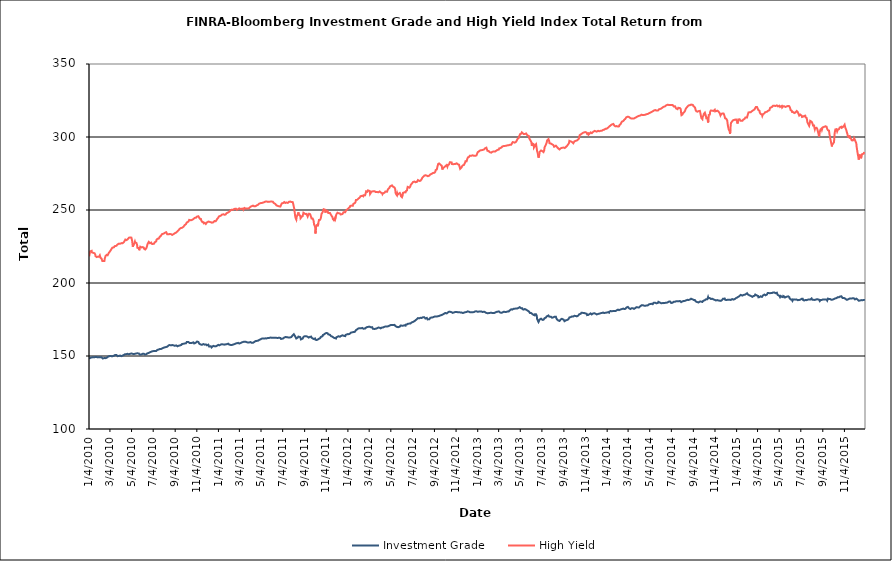
| Category | Investment Grade | High Yield |
|---|---|---|
| 1/4/10 | 148.138 | 218.276 |
| 1/5/10 | 148.728 | 219.533 |
| 1/6/10 | 148.687 | 220.973 |
| 1/7/10 | 148.791 | 221.667 |
| 1/8/10 | 148.871 | 221.768 |
| 1/11/10 | 148.965 | 222.058 |
| 1/12/10 | 149.302 | 220.936 |
| 1/13/10 | 149.169 | 221.002 |
| 1/14/10 | 149.16 | 220.851 |
| 1/15/10 | 149.443 | 220.69 |
| 1/19/10 | 149.142 | 220.408 |
| 1/20/10 | 149.341 | 220.144 |
| 1/21/10 | 149.537 | 219.594 |
| 1/22/10 | 149.358 | 218.364 |
| 1/25/10 | 149.258 | 217.768 |
| 1/26/10 | 149.302 | 217.635 |
| 1/27/10 | 149.185 | 218.028 |
| 1/28/10 | 149.057 | 217.984 |
| 1/29/10 | 149.097 | 217.958 |
| 2/1/10 | 149.11 | 218.038 |
| 2/2/10 | 149.242 | 218.46 |
| 2/3/10 | 149.11 | 218.924 |
| 2/4/10 | 149.181 | 218.611 |
| 2/5/10 | 149.188 | 217.3 |
| 2/8/10 | 149.118 | 216.652 |
| 2/9/10 | 148.96 | 216.199 |
| 2/10/10 | 148.733 | 215.145 |
| 2/11/10 | 148.306 | 214.966 |
| 2/12/10 | 148.631 | 215.187 |
| 2/16/10 | 148.612 | 215.148 |
| 2/17/10 | 148.607 | 216.754 |
| 2/18/10 | 148.543 | 217.542 |
| 2/19/10 | 148.518 | 218.407 |
| 2/22/10 | 148.735 | 219.255 |
| 2/23/10 | 149.048 | 218.904 |
| 2/24/10 | 149.199 | 219.077 |
| 2/25/10 | 149.317 | 219.009 |
| 2/26/10 | 149.72 | 219.579 |
| 3/1/10 | 149.806 | 220.874 |
| 3/2/10 | 149.879 | 221.253 |
| 3/3/10 | 149.999 | 221.505 |
| 3/4/10 | 150.058 | 221.754 |
| 3/5/10 | 149.837 | 222.349 |
| 3/8/10 | 149.871 | 223.336 |
| 3/9/10 | 149.986 | 223.623 |
| 3/10/10 | 149.839 | 224.107 |
| 3/11/10 | 149.843 | 224.21 |
| 3/12/10 | 150.118 | 224.465 |
| 3/15/10 | 150.237 | 224.508 |
| 3/16/10 | 150.455 | 224.314 |
| 3/17/10 | 150.685 | 225.249 |
| 3/18/10 | 150.697 | 225.602 |
| 3/19/10 | 150.695 | 225.533 |
| 3/22/10 | 150.701 | 225.49 |
| 3/23/10 | 150.774 | 225.713 |
| 3/24/10 | 150.157 | 226.224 |
| 3/25/10 | 149.904 | 226.327 |
| 3/26/10 | 149.978 | 226.844 |
| 3/29/10 | 150.108 | 226.98 |
| 3/30/10 | 150.193 | 227.317 |
| 3/31/10 | 150.422 | 227.06 |
| 4/1/10 | 150.302 | 226.854 |
| 4/5/10 | 149.89 | 227.336 |
| 4/6/10 | 149.886 | 227.114 |
| 4/7/10 | 150.166 | 227.482 |
| 4/8/10 | 150.222 | 227.201 |
| 4/9/10 | 150.367 | 227.559 |
| 4/12/10 | 150.743 | 228.013 |
| 4/13/10 | 150.977 | 228.362 |
| 4/14/10 | 151.082 | 228.862 |
| 4/15/10 | 151.197 | 229.417 |
| 4/16/10 | 151.43 | 229.746 |
| 4/19/10 | 151.29 | 229.378 |
| 4/20/10 | 151.303 | 229.613 |
| 4/21/10 | 151.516 | 229.922 |
| 4/22/10 | 151.505 | 229.786 |
| 4/23/10 | 151.187 | 230.343 |
| 4/26/10 | 151.183 | 231.026 |
| 4/27/10 | 151.518 | 230.985 |
| 4/28/10 | 151.375 | 230.656 |
| 4/29/10 | 151.484 | 231.163 |
| 4/30/10 | 151.823 | 231.044 |
| 5/3/10 | 151.714 | 231.082 |
| 5/4/10 | 151.911 | 230.704 |
| 5/5/10 | 151.871 | 229.082 |
| 5/6/10 | 151.518 | 226.956 |
| 5/7/10 | 150.982 | 224.839 |
| 5/10/10 | 151.305 | 226.831 |
| 5/11/10 | 151.261 | 226.496 |
| 5/12/10 | 151.206 | 227.638 |
| 5/13/10 | 151.488 | 228.391 |
| 5/14/10 | 151.808 | 227.589 |
| 5/17/10 | 151.785 | 227.491 |
| 5/18/10 | 151.962 | 227.398 |
| 5/19/10 | 151.883 | 226.231 |
| 5/20/10 | 151.828 | 224.056 |
| 5/21/10 | 151.576 | 223.475 |
| 5/24/10 | 151.744 | 224.018 |
| 5/25/10 | 151.254 | 222.441 |
| 5/26/10 | 151.228 | 223.388 |
| 5/27/10 | 150.909 | 224.158 |
| 5/28/10 | 151.267 | 224.872 |
| 6/1/10 | 151.166 | 224.359 |
| 6/2/10 | 151.005 | 224.369 |
| 6/3/10 | 151.087 | 224.964 |
| 6/4/10 | 151.536 | 224.598 |
| 6/7/10 | 151.568 | 224.254 |
| 6/8/10 | 151.449 | 223.379 |
| 6/9/10 | 151.431 | 223.411 |
| 6/10/10 | 151.033 | 223.391 |
| 6/11/10 | 151.068 | 222.938 |
| 6/14/10 | 151.168 | 223.8 |
| 6/15/10 | 151.237 | 224.435 |
| 6/16/10 | 151.35 | 225.145 |
| 6/17/10 | 151.85 | 226.255 |
| 6/18/10 | 151.95 | 226.827 |
| 6/21/10 | 152.099 | 228.18 |
| 6/22/10 | 152.336 | 227.899 |
| 6/23/10 | 152.544 | 227.893 |
| 6/24/10 | 152.505 | 227.317 |
| 6/25/10 | 152.512 | 227.529 |
| 6/28/10 | 152.919 | 227.662 |
| 6/29/10 | 153.088 | 226.881 |
| 6/30/10 | 153.256 | 227.281 |
| 7/1/10 | 153.26 | 226.657 |
| 7/2/10 | 153.296 | 226.726 |
| 7/6/10 | 153.401 | 226.935 |
| 7/7/10 | 153.275 | 227.239 |
| 7/8/10 | 153.332 | 227.914 |
| 7/9/10 | 153.346 | 228.3 |
| 7/12/10 | 153.406 | 228.5 |
| 7/13/10 | 153.508 | 229.676 |
| 7/14/10 | 153.54 | 229.747 |
| 7/15/10 | 154.186 | 230.02 |
| 7/16/10 | 154.45 | 230.311 |
| 7/19/10 | 154.421 | 230.396 |
| 7/20/10 | 154.571 | 230.597 |
| 7/21/10 | 154.713 | 230.948 |
| 7/22/10 | 154.81 | 231.615 |
| 7/23/10 | 154.787 | 232.159 |
| 7/26/10 | 154.819 | 232.551 |
| 7/27/10 | 154.919 | 233.167 |
| 7/28/10 | 154.953 | 233.424 |
| 7/29/10 | 155.219 | 233.158 |
| 7/30/10 | 155.681 | 233.528 |
| 8/2/10 | 155.664 | 233.845 |
| 8/3/10 | 155.934 | 234.218 |
| 8/4/10 | 155.819 | 234.224 |
| 8/5/10 | 155.907 | 234.331 |
| 8/6/10 | 156.202 | 234.611 |
| 8/9/10 | 156.185 | 234.826 |
| 8/10/10 | 156.305 | 234.462 |
| 8/11/10 | 156.415 | 234.013 |
| 8/12/10 | 156.375 | 233.324 |
| 8/13/10 | 156.5 | 233.036 |
| 8/16/10 | 157.283 | 233.307 |
| 8/17/10 | 157.199 | 233.51 |
| 8/18/10 | 157.299 | 233.735 |
| 8/19/10 | 157.491 | 233.606 |
| 8/20/10 | 157.371 | 233.25 |
| 8/23/10 | 157.306 | 233.433 |
| 8/24/10 | 157.642 | 233.185 |
| 8/25/10 | 157.604 | 233.111 |
| 8/26/10 | 157.53 | 232.964 |
| 8/27/10 | 157.001 | 233.13 |
| 8/30/10 | 157.269 | 233.482 |
| 8/31/10 | 157.502 | 233.106 |
| 9/1/10 | 157.137 | 233.487 |
| 9/2/10 | 156.997 | 233.998 |
| 9/3/10 | 156.836 | 234.431 |
| 9/7/10 | 157.25 | 234.672 |
| 9/8/10 | 157.273 | 234.77 |
| 9/9/10 | 156.872 | 235.138 |
| 9/10/10 | 156.635 | 235.369 |
| 9/13/10 | 157.002 | 236.122 |
| 9/14/10 | 157.428 | 236.022 |
| 9/15/10 | 157.367 | 236.341 |
| 9/16/10 | 157.163 | 237.106 |
| 9/17/10 | 157.231 | 237.261 |
| 9/20/10 | 157.459 | 237.686 |
| 9/21/10 | 157.688 | 238.039 |
| 9/22/10 | 158.121 | 238.12 |
| 9/23/10 | 158.207 | 237.83 |
| 9/24/10 | 157.946 | 237.943 |
| 9/27/10 | 158.387 | 238.553 |
| 9/28/10 | 158.5 | 238.76 |
| 9/29/10 | 158.556 | 239.176 |
| 9/30/10 | 158.574 | 239.596 |
| 10/1/10 | 158.719 | 239.917 |
| 10/4/10 | 158.723 | 240.343 |
| 10/5/10 | 158.915 | 240.842 |
| 10/6/10 | 159.572 | 241.409 |
| 10/7/10 | 159.662 | 241.712 |
| 10/8/10 | 159.778 | 242.02 |
| 10/11/10 | 159.647 | 242.1 |
| 10/12/10 | 159.547 | 242.33 |
| 10/13/10 | 159.368 | 243.238 |
| 10/14/10 | 158.936 | 243.015 |
| 10/15/10 | 158.56 | 242.955 |
| 10/18/10 | 158.841 | 242.956 |
| 10/19/10 | 159.018 | 242.909 |
| 10/20/10 | 159.081 | 242.726 |
| 10/21/10 | 159 | 243.221 |
| 10/22/10 | 158.985 | 243.231 |
| 10/25/10 | 159.316 | 243.831 |
| 10/26/10 | 158.883 | 244.418 |
| 10/27/10 | 158.57 | 244.341 |
| 10/28/10 | 158.749 | 244.582 |
| 10/29/10 | 159.062 | 244.452 |
| 11/1/10 | 159.158 | 244.733 |
| 11/2/10 | 159.471 | 244.362 |
| 11/3/10 | 159.656 | 244.821 |
| 11/4/10 | 159.896 | 245.495 |
| 11/5/10 | 159.653 | 245.54 |
| 11/8/10 | 159.578 | 245.717 |
| 11/9/10 | 159.213 | 245.828 |
| 11/10/10 | 158.489 | 244.84 |
| 11/11/10 | 158.591 | 244.793 |
| 11/12/10 | 158.389 | 244.031 |
| 11/15/10 | 157.814 | 243.894 |
| 11/16/10 | 157.664 | 242.835 |
| 11/17/10 | 157.963 | 242.423 |
| 11/18/10 | 157.658 | 242.693 |
| 11/19/10 | 157.922 | 241.761 |
| 11/22/10 | 158.162 | 241.668 |
| 11/23/10 | 158.357 | 240.889 |
| 11/24/10 | 157.748 | 240.806 |
| 11/26/10 | 157.77 | 241.172 |
| 11/29/10 | 157.93 | 240.436 |
| 11/30/10 | 158.106 | 240.163 |
| 12/1/10 | 157.436 | 240.816 |
| 12/2/10 | 157.319 | 241.508 |
| 12/3/10 | 157.409 | 241.776 |
| 12/6/10 | 157.748 | 242.064 |
| 12/7/10 | 157.248 | 242.309 |
| 12/8/10 | 156.543 | 241.78 |
| 12/9/10 | 156.743 | 241.89 |
| 12/10/10 | 156.679 | 241.503 |
| 12/13/10 | 156.633 | 241.636 |
| 12/14/10 | 156.258 | 241.537 |
| 12/15/10 | 155.875 | 241.161 |
| 12/16/10 | 155.864 | 241.32 |
| 12/17/10 | 156.338 | 241.362 |
| 12/20/10 | 156.934 | 241.546 |
| 12/21/10 | 156.801 | 242.022 |
| 12/22/10 | 156.866 | 242.026 |
| 12/23/10 | 156.734 | 242.402 |
| 12/27/10 | 156.592 | 242.345 |
| 12/28/10 | 156.46 | 242.906 |
| 12/29/10 | 156.734 | 243.104 |
| 12/30/10 | 157 | 243.491 |
| 12/31/10 | 157.322 | 243.889 |
| 1/3/11 | 157.626 | 244.716 |
| 1/4/11 | 157.815 | 245.187 |
| 1/5/11 | 157.257 | 245.618 |
| 1/6/11 | 157.308 | 245.993 |
| 1/7/11 | 157.728 | 245.896 |
| 1/10/11 | 157.85 | 246.09 |
| 1/11/11 | 157.862 | 246.402 |
| 1/12/11 | 157.794 | 246.55 |
| 1/13/11 | 158.013 | 246.81 |
| 1/14/11 | 158.143 | 246.922 |
| 1/18/11 | 157.91 | 247.078 |
| 1/19/11 | 158.148 | 247.099 |
| 1/20/11 | 157.779 | 246.707 |
| 1/21/11 | 157.772 | 246.716 |
| 1/24/11 | 157.98 | 246.961 |
| 1/25/11 | 158.258 | 247.578 |
| 1/26/11 | 158.002 | 247.765 |
| 1/27/11 | 158.085 | 248.289 |
| 1/28/11 | 158.333 | 247.918 |
| 1/31/11 | 158.463 | 248.319 |
| 2/1/11 | 158.167 | 248.646 |
| 2/2/11 | 158.091 | 248.934 |
| 2/3/11 | 157.788 | 248.813 |
| 2/4/11 | 157.483 | 249.293 |
| 2/7/11 | 157.584 | 249.856 |
| 2/8/11 | 157.563 | 250.164 |
| 2/9/11 | 157.528 | 250.282 |
| 2/10/11 | 157.543 | 250.22 |
| 2/11/11 | 157.651 | 250.083 |
| 2/14/11 | 157.832 | 250.194 |
| 2/15/11 | 157.905 | 250.283 |
| 2/16/11 | 157.966 | 250.519 |
| 2/17/11 | 158.084 | 250.733 |
| 2/18/11 | 158.064 | 250.911 |
| 2/22/11 | 158.645 | 250.896 |
| 2/23/11 | 158.66 | 250.602 |
| 2/24/11 | 158.475 | 250.152 |
| 2/25/11 | 158.728 | 250.286 |
| 2/28/11 | 159 | 250.537 |
| 3/1/11 | 159.151 | 250.931 |
| 3/2/11 | 159.145 | 251.083 |
| 3/3/11 | 158.534 | 251.151 |
| 3/4/11 | 158.722 | 250.995 |
| 3/7/11 | 158.888 | 250.721 |
| 3/8/11 | 158.73 | 251.313 |
| 3/9/11 | 158.992 | 251.345 |
| 3/10/11 | 159.281 | 250.84 |
| 3/11/11 | 159.453 | 250.74 |
| 3/14/11 | 159.639 | 250.996 |
| 3/15/11 | 159.696 | 250.261 |
| 3/16/11 | 160.006 | 250.243 |
| 3/17/11 | 159.744 | 250.739 |
| 3/18/11 | 159.878 | 251.393 |
| 3/21/11 | 159.836 | 251.043 |
| 3/22/11 | 159.827 | 251.203 |
| 3/23/11 | 159.71 | 250.998 |
| 3/24/11 | 159.495 | 251.104 |
| 3/25/11 | 159.317 | 250.991 |
| 3/28/11 | 159.199 | 251.006 |
| 3/29/11 | 159.016 | 251.066 |
| 3/30/11 | 159.023 | 251.431 |
| 3/31/11 | 159.304 | 251.272 |
| 4/1/11 | 159.072 | 251.92 |
| 4/4/11 | 159.53 | 252.238 |
| 4/5/11 | 159.285 | 252.698 |
| 4/6/11 | 159.11 | 252.56 |
| 4/7/11 | 159.049 | 252.574 |
| 4/8/11 | 159.041 | 252.811 |
| 4/11/11 | 159.06 | 252.995 |
| 4/12/11 | 159.391 | 252.709 |
| 4/13/11 | 159.584 | 252.682 |
| 4/14/11 | 159.56 | 252.554 |
| 4/15/11 | 159.954 | 252.893 |
| 4/18/11 | 160.215 | 252.622 |
| 4/19/11 | 160.381 | 252.671 |
| 4/20/11 | 160.362 | 252.88 |
| 4/21/11 | 160.327 | 253.09 |
| 4/25/11 | 160.449 | 253.534 |
| 4/26/11 | 160.774 | 253.773 |
| 4/27/11 | 160.593 | 253.724 |
| 4/28/11 | 160.972 | 254.275 |
| 4/29/11 | 161.184 | 254.364 |
| 5/2/11 | 161.378 | 254.711 |
| 5/3/11 | 161.544 | 254.53 |
| 5/4/11 | 161.69 | 254.875 |
| 5/5/11 | 161.863 | 254.808 |
| 5/6/11 | 161.867 | 255.155 |
| 5/9/11 | 162.019 | 255.013 |
| 5/10/11 | 161.844 | 255.551 |
| 5/11/11 | 161.91 | 255.621 |
| 5/12/11 | 161.919 | 255.348 |
| 5/13/11 | 162.003 | 255.328 |
| 5/16/11 | 162.092 | 255.735 |
| 5/17/11 | 162.436 | 255.698 |
| 5/18/11 | 162.239 | 255.708 |
| 5/19/11 | 162.04 | 255.887 |
| 5/20/11 | 162.161 | 255.759 |
| 5/23/11 | 162.38 | 255.548 |
| 5/24/11 | 162.266 | 255.706 |
| 5/25/11 | 162.212 | 255.594 |
| 5/26/11 | 162.355 | 255.674 |
| 5/27/11 | 162.427 | 256.036 |
| 5/31/11 | 162.634 | 255.76 |
| 6/1/11 | 162.928 | 255.849 |
| 6/2/11 | 162.566 | 255.591 |
| 6/3/11 | 162.489 | 255.756 |
| 6/6/11 | 162.453 | 255.667 |
| 6/7/11 | 162.401 | 255.356 |
| 6/8/11 | 162.584 | 254.91 |
| 6/9/11 | 162.504 | 254.704 |
| 6/10/11 | 162.479 | 254.634 |
| 6/13/11 | 162.452 | 254.118 |
| 6/14/11 | 162.032 | 253.948 |
| 6/15/11 | 162.272 | 253.687 |
| 6/16/11 | 162.422 | 253.138 |
| 6/17/11 | 162.412 | 253.373 |
| 6/20/11 | 162.37 | 252.794 |
| 6/21/11 | 162.429 | 252.839 |
| 6/22/11 | 162.449 | 253.214 |
| 6/23/11 | 162.527 | 252.527 |
| 6/24/11 | 162.699 | 252.693 |
| 6/27/11 | 162.361 | 252.368 |
| 6/28/11 | 161.852 | 253.028 |
| 6/29/11 | 161.652 | 253.4 |
| 6/30/11 | 161.582 | 253.619 |
| 7/1/11 | 161.664 | 254.51 |
| 7/5/11 | 162.021 | 254.798 |
| 7/6/11 | 162.135 | 255.008 |
| 7/7/11 | 161.984 | 255.276 |
| 7/8/11 | 162.646 | 255.417 |
| 7/11/11 | 162.928 | 254.826 |
| 7/12/11 | 163.078 | 254.68 |
| 7/13/11 | 163.147 | 255.054 |
| 7/14/11 | 162.932 | 255.182 |
| 7/15/11 | 162.894 | 254.981 |
| 7/18/11 | 162.779 | 254.861 |
| 7/19/11 | 162.716 | 254.905 |
| 7/20/11 | 162.937 | 255.359 |
| 7/21/11 | 162.64 | 255.583 |
| 7/22/11 | 162.835 | 255.706 |
| 7/25/11 | 162.739 | 255.818 |
| 7/26/11 | 162.87 | 256.239 |
| 7/27/11 | 162.9 | 255.731 |
| 7/28/11 | 162.985 | 255.399 |
| 7/29/11 | 163.627 | 255.056 |
| 8/1/11 | 164.219 | 255.393 |
| 8/2/11 | 164.63 | 254.416 |
| 8/3/11 | 164.773 | 253.433 |
| 8/4/11 | 164.945 | 252.108 |
| 8/5/11 | 164.443 | 251.097 |
| 8/8/11 | 163.395 | 245.602 |
| 8/9/11 | 163.141 | 244.507 |
| 8/10/11 | 163.204 | 244.486 |
| 8/11/11 | 161.985 | 243.45 |
| 8/12/11 | 162.398 | 245.222 |
| 8/15/11 | 162.572 | 247.051 |
| 8/16/11 | 162.936 | 247.363 |
| 8/17/11 | 163.319 | 248.419 |
| 8/18/11 | 163.44 | 246.821 |
| 8/19/11 | 163.205 | 246.281 |
| 8/22/11 | 162.937 | 246.179 |
| 8/23/11 | 162.18 | 244.365 |
| 8/24/11 | 161.334 | 243.738 |
| 8/25/11 | 161.636 | 244.871 |
| 8/26/11 | 161.888 | 245.33 |
| 8/29/11 | 161.931 | 245.795 |
| 8/30/11 | 162.637 | 246.122 |
| 8/31/11 | 162.878 | 248.155 |
| 9/1/11 | 163.171 | 248.397 |
| 9/2/11 | 163.433 | 248.749 |
| 9/6/11 | 163.525 | 247.181 |
| 9/7/11 | 163.501 | 247.704 |
| 9/8/11 | 163.55 | 247.68 |
| 9/9/11 | 163.455 | 247.331 |
| 9/12/11 | 163.134 | 245.486 |
| 9/13/11 | 162.81 | 245.818 |
| 9/14/11 | 162.872 | 246.767 |
| 9/15/11 | 162.604 | 247.229 |
| 9/16/11 | 162.758 | 247.457 |
| 9/19/11 | 163.176 | 247.147 |
| 9/20/11 | 163.198 | 247.421 |
| 9/21/11 | 163.313 | 247.136 |
| 9/22/11 | 163.267 | 245.042 |
| 9/23/11 | 162.556 | 244.18 |
| 9/26/11 | 162.073 | 244.218 |
| 9/27/11 | 161.715 | 244.546 |
| 9/28/11 | 161.525 | 243.141 |
| 9/29/11 | 161.625 | 242.219 |
| 9/30/11 | 161.689 | 240.219 |
| 10/3/11 | 162.004 | 238.38 |
| 10/4/11 | 161.143 | 233.908 |
| 10/5/11 | 160.886 | 235.671 |
| 10/6/11 | 160.951 | 238.602 |
| 10/7/11 | 160.961 | 239.592 |
| 10/10/11 | 161.166 | 239.899 |
| 10/11/11 | 160.928 | 238.887 |
| 10/12/11 | 161.23 | 241 |
| 10/13/11 | 161.659 | 241.617 |
| 10/14/11 | 161.731 | 243.19 |
| 10/17/11 | 162.158 | 243.24 |
| 10/18/11 | 162.533 | 243.056 |
| 10/19/11 | 163.006 | 244.34 |
| 10/20/11 | 163.27 | 245.545 |
| 10/21/11 | 163.339 | 247.234 |
| 10/24/11 | 163.572 | 248.376 |
| 10/25/11 | 164.328 | 248.912 |
| 10/26/11 | 164.52 | 248.238 |
| 10/27/11 | 164.511 | 250.561 |
| 10/28/11 | 164.72 | 250.417 |
| 10/31/11 | 165.306 | 250.216 |
| 11/1/11 | 165.588 | 248.202 |
| 11/2/11 | 165.878 | 248.888 |
| 11/3/11 | 165.715 | 249.704 |
| 11/4/11 | 165.525 | 249.34 |
| 11/7/11 | 165.647 | 249.362 |
| 11/8/11 | 165.175 | 249.684 |
| 11/9/11 | 164.87 | 247.965 |
| 11/10/11 | 164.546 | 248.191 |
| 11/11/11 | 164.675 | 248.388 |
| 11/14/11 | 164.476 | 247.916 |
| 11/15/11 | 164.016 | 247.289 |
| 11/16/11 | 164.031 | 246.969 |
| 11/17/11 | 163.585 | 246.641 |
| 11/18/11 | 163.519 | 246.23 |
| 11/21/11 | 163.224 | 245.092 |
| 11/22/11 | 162.875 | 243.879 |
| 11/23/11 | 162.664 | 243.793 |
| 11/25/11 | 162.461 | 242.969 |
| 11/28/11 | 162.222 | 244.54 |
| 11/29/11 | 162.156 | 243.804 |
| 11/30/11 | 162.163 | 244.618 |
| 12/1/11 | 161.972 | 246.167 |
| 12/2/11 | 162.826 | 247.051 |
| 12/5/11 | 163.133 | 248.137 |
| 12/6/11 | 163.241 | 248.226 |
| 12/7/11 | 163.212 | 247.919 |
| 12/8/11 | 163.503 | 247.823 |
| 12/9/11 | 163.137 | 247.71 |
| 12/12/11 | 163.2 | 247.591 |
| 12/13/11 | 163.288 | 247.331 |
| 12/14/11 | 163.464 | 246.905 |
| 12/15/11 | 163.704 | 247.047 |
| 12/16/11 | 164.017 | 247.285 |
| 12/19/11 | 164.19 | 247.198 |
| 12/20/11 | 163.925 | 247.708 |
| 12/21/11 | 163.789 | 247.851 |
| 12/22/11 | 163.874 | 248.444 |
| 12/23/11 | 163.706 | 248.74 |
| 12/27/11 | 163.62 | 248.467 |
| 12/28/11 | 164.409 | 249.294 |
| 12/29/11 | 164.65 | 249.693 |
| 12/30/11 | 165.028 | 249.97 |
| 1/3/12 | 165 | 250.715 |
| 1/4/12 | 164.79 | 250.779 |
| 1/5/12 | 164.735 | 251.086 |
| 1/6/12 | 164.96 | 251.448 |
| 1/9/12 | 165.268 | 251.961 |
| 1/10/12 | 165.441 | 252.742 |
| 1/11/12 | 165.803 | 252.832 |
| 1/12/12 | 166.032 | 253.184 |
| 1/13/12 | 166.183 | 253.02 |
| 1/17/12 | 166.274 | 252.866 |
| 1/18/12 | 166.444 | 253.06 |
| 1/19/12 | 166.456 | 254.263 |
| 1/20/12 | 166.437 | 254.397 |
| 1/23/12 | 166.529 | 254.743 |
| 1/24/12 | 166.417 | 254.88 |
| 1/25/12 | 166.929 | 255.446 |
| 1/26/12 | 167.686 | 256.822 |
| 1/27/12 | 167.976 | 256.959 |
| 1/30/12 | 168.315 | 257.005 |
| 1/31/12 | 168.58 | 256.808 |
| 2/1/12 | 168.573 | 257.523 |
| 2/2/12 | 168.91 | 257.778 |
| 2/3/12 | 168.745 | 257.951 |
| 2/6/12 | 169.019 | 258.538 |
| 2/7/12 | 168.872 | 258.607 |
| 2/8/12 | 169.153 | 259.455 |
| 2/9/12 | 168.938 | 259.817 |
| 2/10/12 | 169.066 | 259.132 |
| 2/13/12 | 169.249 | 259.743 |
| 2/14/12 | 169.29 | 259.486 |
| 2/15/12 | 169.329 | 259.581 |
| 2/16/12 | 168.702 | 259.357 |
| 2/17/12 | 168.808 | 260.074 |
| 2/21/12 | 168.807 | 260.076 |
| 2/22/12 | 169.006 | 260.884 |
| 2/23/12 | 169.182 | 261.495 |
| 2/24/12 | 169.517 | 262.8 |
| 2/27/12 | 169.832 | 262.498 |
| 2/28/12 | 170.084 | 262.863 |
| 2/29/12 | 170.208 | 263.462 |
| 3/1/12 | 169.958 | 263.656 |
| 3/2/12 | 170.404 | 263.482 |
| 3/5/12 | 170.096 | 262.963 |
| 3/6/12 | 169.911 | 260.954 |
| 3/7/12 | 169.867 | 261.475 |
| 3/8/12 | 169.702 | 261.711 |
| 3/9/12 | 169.585 | 262.512 |
| 3/12/12 | 169.759 | 262.676 |
| 3/13/12 | 169.338 | 262.921 |
| 3/14/12 | 168.604 | 263.168 |
| 3/15/12 | 168.553 | 262.878 |
| 3/16/12 | 168.639 | 262.992 |
| 3/19/12 | 168.542 | 262.878 |
| 3/20/12 | 168.348 | 262.477 |
| 3/21/12 | 168.765 | 262.877 |
| 3/22/12 | 168.674 | 262.254 |
| 3/23/12 | 168.965 | 262.017 |
| 3/26/12 | 169.026 | 262.319 |
| 3/27/12 | 169.446 | 262.573 |
| 3/28/12 | 169.432 | 262.566 |
| 3/29/12 | 169.464 | 262.104 |
| 3/30/12 | 169.412 | 262.581 |
| 4/2/12 | 169.408 | 262.705 |
| 4/3/12 | 169.271 | 262.827 |
| 4/4/12 | 168.83 | 262.433 |
| 4/5/12 | 168.956 | 262 |
| 4/9/12 | 169.563 | 261.491 |
| 4/10/12 | 169.66 | 260.789 |
| 4/11/12 | 169.504 | 260.797 |
| 4/12/12 | 169.575 | 261.504 |
| 4/13/12 | 169.893 | 261.894 |
| 4/16/12 | 170.079 | 261.862 |
| 4/17/12 | 169.995 | 262.478 |
| 4/18/12 | 170.068 | 262.661 |
| 4/19/12 | 170.194 | 262.593 |
| 4/20/12 | 170.075 | 262.792 |
| 4/23/12 | 170.258 | 262.506 |
| 4/24/12 | 170.151 | 263.114 |
| 4/25/12 | 170.052 | 263.997 |
| 4/26/12 | 170.32 | 264.193 |
| 4/27/12 | 170.504 | 264.573 |
| 4/30/12 | 170.798 | 265.38 |
| 5/1/12 | 170.791 | 266.079 |
| 5/2/12 | 171.05 | 266.388 |
| 5/3/12 | 171.183 | 266.464 |
| 5/4/12 | 171.332 | 266.529 |
| 5/7/12 | 171.284 | 266.86 |
| 5/8/12 | 171.473 | 266.486 |
| 5/9/12 | 171.253 | 266.124 |
| 5/10/12 | 171.161 | 266.473 |
| 5/11/12 | 171.321 | 266.48 |
| 5/14/12 | 171.318 | 265.403 |
| 5/15/12 | 171.144 | 265.259 |
| 5/16/12 | 170.604 | 264.152 |
| 5/17/12 | 170.27 | 261.717 |
| 5/18/12 | 169.962 | 260.994 |
| 5/21/12 | 169.887 | 259.995 |
| 5/22/12 | 169.745 | 261.241 |
| 5/23/12 | 169.888 | 260.549 |
| 5/24/12 | 169.74 | 260.698 |
| 5/25/12 | 169.974 | 261.09 |
| 5/29/12 | 170.104 | 261.678 |
| 5/30/12 | 170.523 | 261.215 |
| 5/31/12 | 170.894 | 260.94 |
| 6/1/12 | 171.018 | 259.478 |
| 6/4/12 | 170.775 | 258.736 |
| 6/5/12 | 170.482 | 258.384 |
| 6/6/12 | 170.426 | 260.187 |
| 6/7/12 | 170.775 | 261.74 |
| 6/8/12 | 170.965 | 261.457 |
| 6/11/12 | 171.032 | 262.151 |
| 6/12/12 | 170.646 | 261.8 |
| 6/13/12 | 170.807 | 262.045 |
| 6/14/12 | 170.791 | 262.064 |
| 6/15/12 | 171.482 | 262.908 |
| 6/18/12 | 171.637 | 263.399 |
| 6/19/12 | 171.659 | 264.743 |
| 6/20/12 | 171.768 | 265.827 |
| 6/21/12 | 172.115 | 265.94 |
| 6/22/12 | 172.025 | 265.728 |
| 6/25/12 | 172.199 | 265.279 |
| 6/26/12 | 172.058 | 265.524 |
| 6/27/12 | 172.152 | 265.968 |
| 6/28/12 | 172.304 | 266.213 |
| 6/29/12 | 172.257 | 267.309 |
| 7/2/12 | 173.09 | 268.096 |
| 7/3/12 | 173.221 | 268.752 |
| 7/5/12 | 173.316 | 269.146 |
| 7/6/12 | 173.56 | 269.538 |
| 7/9/12 | 173.833 | 269.493 |
| 7/10/12 | 174.086 | 269.579 |
| 7/11/12 | 174.259 | 269.722 |
| 7/12/12 | 174.453 | 269.04 |
| 7/13/12 | 174.699 | 269.154 |
| 7/16/12 | 175.24 | 269.239 |
| 7/17/12 | 175.328 | 269.334 |
| 7/18/12 | 175.845 | 269.69 |
| 7/19/12 | 175.973 | 270.505 |
| 7/20/12 | 175.936 | 270.235 |
| 7/23/12 | 175.822 | 269.894 |
| 7/24/12 | 176.004 | 269.604 |
| 7/25/12 | 176.025 | 269.406 |
| 7/26/12 | 176.118 | 270.041 |
| 7/27/12 | 175.687 | 270.63 |
| 7/30/12 | 176.107 | 271.303 |
| 7/31/12 | 176.44 | 272.05 |
| 8/1/12 | 176.338 | 272.672 |
| 8/2/12 | 176.512 | 272.465 |
| 8/3/12 | 176.119 | 272.799 |
| 8/6/12 | 176.532 | 273.572 |
| 8/7/12 | 176.104 | 274.005 |
| 8/8/12 | 175.944 | 273.748 |
| 8/9/12 | 175.686 | 273.786 |
| 8/10/12 | 176.002 | 273.401 |
| 8/13/12 | 176.09 | 273.532 |
| 8/14/12 | 175.65 | 273.594 |
| 8/15/12 | 175.071 | 273.101 |
| 8/16/12 | 174.906 | 273.147 |
| 8/17/12 | 174.987 | 273.072 |
| 8/20/12 | 175.143 | 273.57 |
| 8/21/12 | 175.21 | 274.034 |
| 8/22/12 | 175.778 | 274.203 |
| 8/23/12 | 176.169 | 274.362 |
| 8/24/12 | 176.127 | 274.551 |
| 8/27/12 | 176.358 | 274.825 |
| 8/28/12 | 176.454 | 275.031 |
| 8/29/12 | 176.284 | 274.914 |
| 8/30/12 | 176.477 | 275.32 |
| 8/31/12 | 176.81 | 275.392 |
| 9/4/12 | 177.032 | 275.567 |
| 9/5/12 | 176.91 | 275.631 |
| 9/6/12 | 176.68 | 276.312 |
| 9/7/12 | 177.103 | 277.344 |
| 9/10/12 | 177.002 | 277.72 |
| 9/11/12 | 177.098 | 278.556 |
| 9/12/12 | 177.05 | 279.736 |
| 9/13/12 | 177.212 | 280.396 |
| 9/14/12 | 177.169 | 281.535 |
| 9/17/12 | 177.454 | 281.887 |
| 9/18/12 | 177.646 | 281.586 |
| 9/19/12 | 177.912 | 281.618 |
| 9/20/12 | 177.78 | 281.149 |
| 9/21/12 | 177.838 | 281.063 |
| 9/24/12 | 178.1 | 280.276 |
| 9/25/12 | 178.087 | 279.718 |
| 9/26/12 | 178.216 | 277.714 |
| 9/27/12 | 178.469 | 278.535 |
| 9/28/12 | 178.688 | 278.908 |
| 10/1/12 | 178.975 | 279.276 |
| 10/2/12 | 179.149 | 279.208 |
| 10/3/12 | 179.331 | 279.587 |
| 10/4/12 | 179.471 | 279.992 |
| 10/5/12 | 179.287 | 280.375 |
| 10/8/12 | 179.17 | 280.811 |
| 10/9/12 | 179.42 | 280.214 |
| 10/10/12 | 179.403 | 279.596 |
| 10/11/12 | 179.787 | 280.444 |
| 10/12/12 | 180.286 | 280.729 |
| 10/15/12 | 180.386 | 281.353 |
| 10/16/12 | 180.411 | 281.917 |
| 10/17/12 | 180.427 | 282.705 |
| 10/18/12 | 180.252 | 282.93 |
| 10/19/12 | 180.181 | 282.592 |
| 10/22/12 | 179.984 | 282.579 |
| 10/23/12 | 179.808 | 281.491 |
| 10/24/12 | 179.787 | 281.88 |
| 10/25/12 | 179.532 | 282.013 |
| 10/26/12 | 179.776 | 281.343 |
| 10/29/12 | 179.874 | 281.464 |
| 10/30/12 | 179.896 | 281.521 |
| 10/31/12 | 180.158 | 281.409 |
| 11/1/12 | 180.105 | 281.505 |
| 11/2/12 | 180.019 | 281.845 |
| 11/5/12 | 180.13 | 282.006 |
| 11/6/12 | 179.794 | 282.389 |
| 11/7/12 | 179.95 | 281.412 |
| 11/8/12 | 180.011 | 281.342 |
| 11/9/12 | 179.956 | 280.712 |
| 11/12/12 | 179.993 | 281.011 |
| 11/13/12 | 180.036 | 279.914 |
| 11/14/12 | 180.015 | 279.447 |
| 11/15/12 | 179.863 | 278.145 |
| 11/16/12 | 179.799 | 277.878 |
| 11/19/12 | 179.795 | 279.127 |
| 11/20/12 | 179.615 | 279.948 |
| 11/21/12 | 179.343 | 280.164 |
| 11/23/12 | 179.415 | 280.637 |
| 11/26/12 | 179.727 | 280.898 |
| 11/27/12 | 179.835 | 281.598 |
| 11/28/12 | 179.951 | 281.767 |
| 11/29/12 | 179.975 | 282.593 |
| 11/30/12 | 180.118 | 283.394 |
| 12/3/12 | 180.152 | 283.319 |
| 12/4/12 | 180.225 | 283.828 |
| 12/5/12 | 180.496 | 284.899 |
| 12/6/12 | 180.562 | 285.395 |
| 12/7/12 | 180.315 | 286.027 |
| 12/10/12 | 180.348 | 286.385 |
| 12/11/12 | 180.223 | 286.768 |
| 12/12/12 | 180.123 | 287.14 |
| 12/13/12 | 179.907 | 287.331 |
| 12/14/12 | 180.071 | 287.179 |
| 12/17/12 | 179.933 | 287.169 |
| 12/18/12 | 179.627 | 287.436 |
| 12/19/12 | 179.934 | 287.562 |
| 12/20/12 | 179.999 | 287.474 |
| 12/21/12 | 180.203 | 286.963 |
| 12/24/12 | 180.079 | 287.133 |
| 12/26/12 | 180.197 | 286.749 |
| 12/27/12 | 180.542 | 287.091 |
| 12/28/12 | 180.711 | 287.206 |
| 12/31/12 | 180.615 | 287.373 |
| 1/2/13 | 180.418 | 288.714 |
| 1/3/13 | 180.314 | 289.229 |
| 1/4/13 | 180.218 | 289.691 |
| 1/7/13 | 180.416 | 290.115 |
| 1/8/13 | 180.534 | 290.229 |
| 1/9/13 | 180.497 | 290.492 |
| 1/10/13 | 180.403 | 290.811 |
| 1/11/13 | 180.366 | 291.068 |
| 1/14/13 | 180.474 | 290.972 |
| 1/15/13 | 180.457 | 290.556 |
| 1/16/13 | 180.451 | 290.825 |
| 1/17/13 | 180.126 | 291.101 |
| 1/18/13 | 180.262 | 291.424 |
| 1/22/13 | 180.359 | 291.542 |
| 1/23/13 | 180.414 | 291.942 |
| 1/24/13 | 180.258 | 292.239 |
| 1/25/13 | 179.88 | 292.639 |
| 1/28/13 | 179.528 | 292.699 |
| 1/29/13 | 179.475 | 291.968 |
| 1/30/13 | 179.216 | 291.435 |
| 1/31/13 | 179.282 | 290.547 |
| 2/1/13 | 179.319 | 290.795 |
| 2/4/13 | 179.396 | 290.328 |
| 2/5/13 | 179.186 | 289.927 |
| 2/6/13 | 179.33 | 289.626 |
| 2/7/13 | 179.53 | 289.348 |
| 2/8/13 | 179.424 | 289.123 |
| 2/11/13 | 179.601 | 289.312 |
| 2/12/13 | 179.432 | 289.517 |
| 2/13/13 | 179.276 | 289.685 |
| 2/14/13 | 179.47 | 289.903 |
| 2/15/13 | 179.428 | 289.938 |
| 2/19/13 | 179.436 | 290.138 |
| 2/20/13 | 179.393 | 290.311 |
| 2/21/13 | 179.67 | 289.894 |
| 2/22/13 | 179.791 | 290.126 |
| 2/25/13 | 180.195 | 290.674 |
| 2/26/13 | 180.36 | 290.49 |
| 2/27/13 | 180.275 | 290.647 |
| 2/28/13 | 180.295 | 291.129 |
| 3/1/13 | 180.498 | 291.056 |
| 3/4/13 | 180.547 | 291.371 |
| 3/5/13 | 180.405 | 292.183 |
| 3/6/13 | 180.162 | 292.263 |
| 3/7/13 | 179.864 | 292.342 |
| 3/8/13 | 179.491 | 292.364 |
| 3/11/13 | 179.561 | 292.71 |
| 3/12/13 | 179.833 | 292.986 |
| 3/13/13 | 179.763 | 292.997 |
| 3/14/13 | 179.781 | 293.521 |
| 3/15/13 | 180.017 | 293.66 |
| 3/18/13 | 180.309 | 293.843 |
| 3/19/13 | 180.56 | 293.925 |
| 3/20/13 | 180.234 | 294.009 |
| 3/21/13 | 180.19 | 293.882 |
| 3/22/13 | 180.169 | 293.97 |
| 3/25/13 | 180.202 | 294.027 |
| 3/26/13 | 180.105 | 293.998 |
| 3/27/13 | 180.419 | 294.128 |
| 3/28/13 | 180.443 | 294.272 |
| 4/1/13 | 180.531 | 294.371 |
| 4/2/13 | 180.461 | 294.579 |
| 4/3/13 | 180.789 | 294.607 |
| 4/4/13 | 181.285 | 294.648 |
| 4/5/13 | 181.945 | 294.632 |
| 4/8/13 | 182.004 | 294.735 |
| 4/9/13 | 182.049 | 295.329 |
| 4/10/13 | 181.764 | 295.607 |
| 4/11/13 | 181.777 | 296.149 |
| 4/12/13 | 182.134 | 296.506 |
| 4/15/13 | 182.382 | 296.343 |
| 4/16/13 | 182.309 | 296.556 |
| 4/17/13 | 182.364 | 296.241 |
| 4/18/13 | 182.416 | 296.14 |
| 4/19/13 | 182.332 | 296.394 |
| 4/22/13 | 182.498 | 296.78 |
| 4/23/13 | 182.612 | 297.392 |
| 4/24/13 | 182.699 | 297.751 |
| 4/25/13 | 182.517 | 298.19 |
| 4/26/13 | 182.907 | 298.71 |
| 4/29/13 | 183.005 | 299.268 |
| 4/30/13 | 183.021 | 300.067 |
| 5/1/13 | 183.331 | 300.856 |
| 5/2/13 | 183.461 | 301.386 |
| 5/3/13 | 182.88 | 301.968 |
| 5/6/13 | 182.703 | 302.267 |
| 5/7/13 | 182.682 | 302.749 |
| 5/8/13 | 182.755 | 303.216 |
| 5/9/13 | 182.747 | 303.174 |
| 5/10/13 | 182.048 | 302.716 |
| 5/13/13 | 181.775 | 302.027 |
| 5/14/13 | 181.74 | 301.767 |
| 5/15/13 | 181.725 | 301.705 |
| 5/16/13 | 182.182 | 302.013 |
| 5/17/13 | 181.879 | 302.136 |
| 5/20/13 | 181.74 | 302.424 |
| 5/21/13 | 181.831 | 302.406 |
| 5/22/13 | 181.51 | 302.291 |
| 5/23/13 | 181.254 | 301.321 |
| 5/24/13 | 181.269 | 300.988 |
| 5/28/13 | 180.478 | 300.573 |
| 5/29/13 | 179.983 | 298.941 |
| 5/30/13 | 179.917 | 298.874 |
| 5/31/13 | 179.394 | 298.159 |
| 6/3/13 | 179.454 | 296.868 |
| 6/4/13 | 179.162 | 296.146 |
| 6/5/13 | 178.829 | 293.959 |
| 6/6/13 | 178.861 | 293.342 |
| 6/7/13 | 178.695 | 295.478 |
| 6/10/13 | 178.13 | 295.107 |
| 6/11/13 | 177.577 | 292.825 |
| 6/12/13 | 177.663 | 293.39 |
| 6/13/13 | 177.842 | 292.841 |
| 6/14/13 | 178.613 | 294.18 |
| 6/17/13 | 178.554 | 295.091 |
| 6/18/13 | 178.04 | 294.81 |
| 6/19/13 | 177.631 | 294.581 |
| 6/20/13 | 175.366 | 290.384 |
| 6/21/13 | 174.752 | 289.646 |
| 6/24/13 | 173.249 | 285.828 |
| 6/25/13 | 173.543 | 286.221 |
| 6/26/13 | 174.232 | 287.65 |
| 6/27/13 | 174.959 | 289.73 |
| 6/28/13 | 175.137 | 290.228 |
| 7/1/13 | 175.576 | 290.788 |
| 7/2/13 | 175.941 | 291.105 |
| 7/3/13 | 175.988 | 290.585 |
| 7/5/13 | 174.738 | 290.273 |
| 7/8/13 | 174.822 | 289.667 |
| 7/9/13 | 175.184 | 290.346 |
| 7/10/13 | 175.151 | 290.844 |
| 7/11/13 | 175.898 | 292.926 |
| 7/12/13 | 176.14 | 293.609 |
| 7/15/13 | 176.351 | 294.919 |
| 7/16/13 | 176.666 | 295.47 |
| 7/17/13 | 177.121 | 296.161 |
| 7/18/13 | 177.12 | 297.519 |
| 7/19/13 | 177.42 | 297.862 |
| 7/22/13 | 177.769 | 298.556 |
| 7/23/13 | 177.698 | 298.585 |
| 7/24/13 | 176.991 | 297.183 |
| 7/25/13 | 176.669 | 295.729 |
| 7/26/13 | 177.005 | 295.673 |
| 7/29/13 | 176.886 | 295.5 |
| 7/30/13 | 176.857 | 295.631 |
| 7/31/13 | 176.508 | 295.054 |
| 8/1/13 | 176.191 | 295.026 |
| 8/2/13 | 176.666 | 294.693 |
| 8/5/13 | 176.529 | 294.436 |
| 8/6/13 | 176.451 | 293.84 |
| 8/7/13 | 176.654 | 293.33 |
| 8/8/13 | 176.91 | 293.6 |
| 8/9/13 | 176.889 | 293.805 |
| 8/12/13 | 176.834 | 294.05 |
| 8/13/13 | 176.01 | 293.634 |
| 8/14/13 | 175.868 | 293.796 |
| 8/15/13 | 175.063 | 293.112 |
| 8/16/13 | 174.752 | 292.875 |
| 8/19/13 | 174.276 | 292.095 |
| 8/20/13 | 174.561 | 291.862 |
| 8/21/13 | 174.282 | 291.78 |
| 8/22/13 | 173.987 | 291.473 |
| 8/23/13 | 174.557 | 291.996 |
| 8/26/13 | 175.088 | 292.307 |
| 8/27/13 | 175.55 | 292.162 |
| 8/28/13 | 175.33 | 292.241 |
| 8/29/13 | 175.469 | 292.563 |
| 8/30/13 | 175.752 | 293.08 |
| 9/3/13 | 174.857 | 292.778 |
| 9/4/13 | 174.803 | 292.764 |
| 9/5/13 | 173.839 | 292.314 |
| 9/6/13 | 174.212 | 292.438 |
| 9/9/13 | 174.432 | 293.107 |
| 9/10/13 | 174.027 | 293 |
| 9/11/13 | 174.23 | 293.246 |
| 9/12/13 | 174.624 | 293.821 |
| 9/13/13 | 174.528 | 294.088 |
| 9/16/13 | 175.136 | 295.082 |
| 9/17/13 | 175.056 | 295.217 |
| 9/18/13 | 175.426 | 295.876 |
| 9/19/13 | 176.394 | 297.362 |
| 9/20/13 | 176.442 | 297.438 |
| 9/23/13 | 176.64 | 296.94 |
| 9/24/13 | 177.073 | 297.042 |
| 9/25/13 | 177.29 | 296.788 |
| 9/26/13 | 177.116 | 296.649 |
| 9/27/13 | 177.17 | 296.298 |
| 9/30/13 | 177.029 | 295.684 |
| 10/1/13 | 177.035 | 296.078 |
| 10/2/13 | 177.315 | 296.334 |
| 10/3/13 | 177.535 | 296.928 |
| 10/4/13 | 177.247 | 297.16 |
| 10/7/13 | 177.419 | 297.396 |
| 10/8/13 | 177.369 | 297.091 |
| 10/9/13 | 177.218 | 296.983 |
| 10/10/13 | 177.152 | 297.583 |
| 10/11/13 | 177.569 | 298.016 |
| 10/14/13 | 177.705 | 298.362 |
| 10/15/13 | 177.422 | 298.46 |
| 10/16/13 | 177.683 | 299.078 |
| 10/17/13 | 178.623 | 300.339 |
| 10/18/13 | 179.055 | 301.275 |
| 10/21/13 | 178.946 | 301.75 |
| 10/22/13 | 179.5 | 302.295 |
| 10/23/13 | 179.642 | 302.152 |
| 10/24/13 | 179.451 | 302.314 |
| 10/25/13 | 179.509 | 302.45 |
| 10/28/13 | 179.497 | 302.947 |
| 10/29/13 | 179.506 | 303.014 |
| 10/30/13 | 179.7 | 303.179 |
| 10/31/13 | 179.418 | 303.199 |
| 11/1/13 | 179.055 | 302.946 |
| 11/4/13 | 179.086 | 303.346 |
| 11/5/13 | 178.619 | 302.838 |
| 11/6/13 | 178.743 | 302.912 |
| 11/7/13 | 178.912 | 302.935 |
| 11/8/13 | 178.027 | 302.168 |
| 11/11/13 | 178.148 | 302.481 |
| 11/12/13 | 177.732 | 301.574 |
| 11/13/13 | 178.044 | 301.25 |
| 11/14/13 | 178.581 | 301.928 |
| 11/15/13 | 178.699 | 302.34 |
| 11/18/13 | 179.216 | 303.154 |
| 11/19/13 | 179.056 | 303.064 |
| 11/20/13 | 178.763 | 302.951 |
| 11/21/13 | 178.483 | 302.637 |
| 11/22/13 | 178.866 | 303.162 |
| 11/25/13 | 179.18 | 303.49 |
| 11/26/13 | 179.447 | 303.451 |
| 11/27/13 | 179.295 | 303.964 |
| 11/29/13 | 179.243 | 304.187 |
| 12/2/13 | 178.936 | 303.959 |
| 12/3/13 | 179.077 | 304.022 |
| 12/4/13 | 178.638 | 303.759 |
| 12/5/13 | 178.482 | 303.661 |
| 12/6/13 | 178.524 | 303.958 |
| 12/9/13 | 178.794 | 304.229 |
| 12/10/13 | 179.26 | 304.454 |
| 12/11/13 | 179.244 | 304.384 |
| 12/12/13 | 178.971 | 303.923 |
| 12/13/13 | 179.064 | 304.033 |
| 12/16/13 | 179.328 | 304.232 |
| 12/17/13 | 179.548 | 304.208 |
| 12/18/13 | 179.531 | 304.127 |
| 12/19/13 | 179.415 | 304.237 |
| 12/20/13 | 179.659 | 304.524 |
| 12/23/13 | 179.774 | 304.868 |
| 12/24/13 | 179.596 | 304.866 |
| 12/26/13 | 179.421 | 304.99 |
| 12/27/13 | 179.346 | 305.23 |
| 12/30/13 | 179.619 | 305.626 |
| 12/31/13 | 179.735 | 305.727 |
| 1/2/14 | 179.728 | 305.662 |
| 1/3/14 | 179.753 | 305.864 |
| 1/6/14 | 180.039 | 306.408 |
| 1/7/14 | 180.116 | 306.94 |
| 1/8/14 | 179.579 | 306.969 |
| 1/9/14 | 179.671 | 307.098 |
| 1/10/14 | 180.4 | 307.505 |
| 1/13/14 | 180.811 | 307.909 |
| 1/14/14 | 180.596 | 307.963 |
| 1/15/14 | 180.41 | 308.397 |
| 1/16/14 | 180.672 | 308.499 |
| 1/17/14 | 180.742 | 308.963 |
| 1/21/14 | 180.804 | 308.937 |
| 1/22/14 | 180.542 | 309.084 |
| 1/23/14 | 180.718 | 308.76 |
| 1/24/14 | 180.846 | 307.697 |
| 1/27/14 | 180.803 | 307.291 |
| 1/28/14 | 180.86 | 307.421 |
| 1/29/14 | 181.147 | 307.34 |
| 1/30/14 | 181.221 | 307.5 |
| 1/31/14 | 181.355 | 307.291 |
| 2/3/14 | 181.763 | 307.131 |
| 2/4/14 | 181.689 | 307.001 |
| 2/5/14 | 181.423 | 306.844 |
| 2/6/14 | 181.395 | 307.294 |
| 2/7/14 | 181.768 | 308.141 |
| 2/10/14 | 181.871 | 308.736 |
| 2/11/14 | 181.686 | 309.108 |
| 2/12/14 | 181.564 | 309.671 |
| 2/13/14 | 182.068 | 309.957 |
| 2/14/14 | 182.2 | 310.47 |
| 2/18/14 | 182.466 | 310.993 |
| 2/19/14 | 182.465 | 311.258 |
| 2/20/14 | 182.013 | 311.434 |
| 2/21/14 | 182.187 | 311.855 |
| 2/24/14 | 182.309 | 312.532 |
| 2/25/14 | 182.786 | 313.061 |
| 2/26/14 | 182.966 | 313.386 |
| 2/27/14 | 183.242 | 313.688 |
| 2/28/14 | 183.242 | 313.95 |
| 3/3/14 | 183.617 | 313.958 |
| 3/4/14 | 183.201 | 314.086 |
| 3/5/14 | 183.098 | 314.146 |
| 3/6/14 | 182.707 | 313.68 |
| 3/7/14 | 182.162 | 313.23 |
| 3/10/14 | 182.161 | 312.94 |
| 3/11/14 | 182.18 | 312.996 |
| 3/12/14 | 182.373 | 312.805 |
| 3/13/14 | 182.68 | 312.601 |
| 3/14/14 | 182.791 | 312.17 |
| 3/17/14 | 182.764 | 312.694 |
| 3/18/14 | 182.841 | 312.994 |
| 3/19/14 | 182.684 | 313.321 |
| 3/20/14 | 182.283 | 312.665 |
| 3/21/14 | 182.579 | 313.2 |
| 3/24/14 | 182.821 | 313.213 |
| 3/25/14 | 182.966 | 313.327 |
| 3/26/14 | 183.239 | 313.866 |
| 3/27/14 | 183.453 | 313.624 |
| 3/28/14 | 183.28 | 313.939 |
| 3/31/14 | 183.295 | 314.186 |
| 4/1/14 | 183.326 | 314.175 |
| 4/2/14 | 182.944 | 314.368 |
| 4/3/14 | 183.181 | 314.462 |
| 4/4/14 | 183.667 | 314.772 |
| 4/7/14 | 184.06 | 314.72 |
| 4/8/14 | 184.138 | 314.878 |
| 4/9/14 | 184.201 | 315.146 |
| 4/10/14 | 184.696 | 315.282 |
| 4/11/14 | 184.791 | 314.863 |
| 4/14/14 | 184.777 | 315.029 |
| 4/15/14 | 184.821 | 314.902 |
| 4/16/14 | 184.74 | 315.02 |
| 4/17/14 | 184.509 | 315.085 |
| 4/21/14 | 184.449 | 315.235 |
| 4/22/14 | 184.345 | 315.366 |
| 4/23/14 | 184.609 | 315.544 |
| 4/24/14 | 184.557 | 315.604 |
| 4/25/14 | 184.79 | 315.711 |
| 4/28/14 | 184.686 | 315.777 |
| 4/29/14 | 184.555 | 315.908 |
| 4/30/14 | 184.879 | 316.245 |
| 5/1/14 | 185.332 | 316.202 |
| 5/2/14 | 185.496 | 316.636 |
| 5/5/14 | 185.588 | 316.655 |
| 5/6/14 | 185.606 | 316.793 |
| 5/7/14 | 185.64 | 316.933 |
| 5/8/14 | 185.782 | 317.079 |
| 5/9/14 | 185.695 | 317.384 |
| 5/12/14 | 185.477 | 317.601 |
| 5/13/14 | 185.77 | 317.893 |
| 5/14/14 | 186.391 | 318.157 |
| 5/15/14 | 186.658 | 318.079 |
| 5/16/14 | 186.536 | 318.037 |
| 5/19/14 | 186.535 | 318.482 |
| 5/20/14 | 186.465 | 318.324 |
| 5/21/14 | 186.201 | 318.324 |
| 5/22/14 | 186.056 | 318.13 |
| 5/23/14 | 186.327 | 318.26 |
| 5/27/14 | 186.419 | 318.216 |
| 5/28/14 | 187.106 | 318.396 |
| 5/29/14 | 187.185 | 318.6 |
| 5/30/14 | 186.936 | 318.99 |
| 6/2/14 | 186.525 | 319.196 |
| 6/3/14 | 186.096 | 318.824 |
| 6/4/14 | 185.923 | 318.923 |
| 6/5/14 | 186.096 | 319.519 |
| 6/6/14 | 186.357 | 319.906 |
| 6/9/14 | 186.269 | 320.267 |
| 6/10/14 | 186.071 | 320.527 |
| 6/11/14 | 186.117 | 320.701 |
| 6/12/14 | 186.209 | 320.732 |
| 6/13/14 | 186.298 | 320.741 |
| 6/16/14 | 186.394 | 321.02 |
| 6/17/14 | 186.061 | 320.916 |
| 6/18/14 | 186.227 | 321.023 |
| 6/19/14 | 186.477 | 321.712 |
| 6/20/14 | 186.358 | 321.828 |
| 6/23/14 | 186.687 | 322.129 |
| 6/24/14 | 186.768 | 322.229 |
| 6/25/14 | 187.112 | 322.061 |
| 6/26/14 | 187.237 | 321.92 |
| 6/27/14 | 187.246 | 321.907 |
| 6/30/14 | 187.28 | 321.988 |
| 7/1/14 | 186.985 | 321.994 |
| 7/2/14 | 186.597 | 321.974 |
| 7/3/14 | 186.327 | 321.934 |
| 7/7/14 | 186.526 | 321.932 |
| 7/8/14 | 186.93 | 321.735 |
| 7/9/14 | 186.875 | 321.432 |
| 7/10/14 | 187.101 | 320.961 |
| 7/11/14 | 187.261 | 320.984 |
| 7/14/14 | 187.168 | 320.983 |
| 7/15/14 | 187.05 | 320.744 |
| 7/16/14 | 187.124 | 320.402 |
| 7/17/14 | 187.478 | 319.546 |
| 7/18/14 | 187.415 | 319.119 |
| 7/21/14 | 187.552 | 319.067 |
| 7/22/14 | 187.59 | 319.413 |
| 7/23/14 | 187.802 | 320.013 |
| 7/24/14 | 187.45 | 320.044 |
| 7/25/14 | 187.698 | 320.029 |
| 7/28/14 | 187.674 | 319.769 |
| 7/29/14 | 187.837 | 319.656 |
| 7/30/14 | 187.301 | 319.047 |
| 7/31/14 | 186.886 | 316.528 |
| 8/1/14 | 187.092 | 314.942 |
| 8/4/14 | 187.413 | 315.476 |
| 8/5/14 | 187.252 | 316.358 |
| 8/6/14 | 187.363 | 316.277 |
| 8/7/14 | 187.673 | 316.579 |
| 8/8/14 | 187.896 | 316.826 |
| 8/11/14 | 187.77 | 317.856 |
| 8/12/14 | 187.676 | 318.383 |
| 8/13/14 | 187.876 | 319.344 |
| 8/14/14 | 188.161 | 319.663 |
| 8/15/14 | 188.62 | 319.986 |
| 8/18/14 | 188.479 | 320.831 |
| 8/19/14 | 188.396 | 321.336 |
| 8/20/14 | 188.206 | 321.492 |
| 8/21/14 | 188.347 | 321.61 |
| 8/22/14 | 188.447 | 321.622 |
| 8/25/14 | 188.701 | 321.818 |
| 8/26/14 | 188.792 | 322.093 |
| 8/27/14 | 188.959 | 322.039 |
| 8/28/14 | 189.247 | 322.212 |
| 8/29/14 | 189.332 | 322.307 |
| 9/2/14 | 188.727 | 321.963 |
| 9/3/14 | 188.618 | 321.632 |
| 9/4/14 | 188.349 | 321.109 |
| 9/5/14 | 188.346 | 320.463 |
| 9/8/14 | 188.284 | 320.285 |
| 9/9/14 | 187.806 | 319.5 |
| 9/10/14 | 187.427 | 318.374 |
| 9/11/14 | 187.429 | 317.872 |
| 9/12/14 | 186.837 | 317.625 |
| 9/15/14 | 186.884 | 317.32 |
| 9/16/14 | 186.942 | 316.989 |
| 9/17/14 | 186.928 | 317.395 |
| 9/18/14 | 186.65 | 317.716 |
| 9/19/14 | 186.954 | 318.104 |
| 9/22/14 | 187.276 | 317.886 |
| 9/23/14 | 187.426 | 316.785 |
| 9/24/14 | 187.209 | 316.242 |
| 9/25/14 | 187.279 | 314.369 |
| 9/26/14 | 186.843 | 313.067 |
| 9/29/14 | 187.044 | 312.227 |
| 9/30/14 | 187.078 | 313.839 |
| 10/1/14 | 187.741 | 314.5 |
| 10/2/14 | 187.805 | 314.68 |
| 10/3/14 | 187.775 | 315.764 |
| 10/6/14 | 188.229 | 316.652 |
| 10/7/14 | 188.613 | 315.906 |
| 10/8/14 | 188.736 | 315.449 |
| 10/9/14 | 188.86 | 314.322 |
| 10/10/14 | 188.827 | 312.945 |
| 10/13/14 | 188.921 | 313.229 |
| 10/14/14 | 189.474 | 311.473 |
| 10/15/14 | 190.361 | 309.937 |
| 10/16/14 | 189.617 | 311.032 |
| 10/17/14 | 189.527 | 315.087 |
| 10/20/14 | 189.692 | 315.391 |
| 10/21/14 | 189.622 | 317.481 |
| 10/22/14 | 189.473 | 317.828 |
| 10/23/14 | 189.056 | 318.169 |
| 10/24/14 | 189.113 | 318.268 |
| 10/27/14 | 189.192 | 317.999 |
| 10/28/14 | 189.053 | 318.308 |
| 10/29/14 | 188.673 | 318.003 |
| 10/30/14 | 188.788 | 317.85 |
| 10/31/14 | 188.531 | 318.489 |
| 11/3/14 | 188.389 | 318.666 |
| 11/4/14 | 188.42 | 317.568 |
| 11/5/14 | 188.206 | 317.764 |
| 11/6/14 | 188.056 | 317.831 |
| 11/7/14 | 188.309 | 317.73 |
| 11/10/14 | 188.303 | 318.028 |
| 11/11/14 | 188.337 | 318.366 |
| 11/12/14 | 188.151 | 317.973 |
| 11/13/14 | 188.062 | 317.544 |
| 11/14/14 | 188.002 | 316.97 |
| 11/17/14 | 187.855 | 316.264 |
| 11/18/14 | 187.783 | 315.504 |
| 11/19/14 | 187.533 | 314.749 |
| 11/20/14 | 187.762 | 314.823 |
| 11/21/14 | 188.187 | 315.646 |
| 11/24/14 | 188.506 | 316.096 |
| 11/25/14 | 188.832 | 316.289 |
| 11/26/14 | 189.221 | 316.481 |
| 11/28/14 | 189.453 | 316.019 |
| 12/1/14 | 189.339 | 313.923 |
| 12/2/14 | 188.594 | 312.837 |
| 12/3/14 | 188.505 | 313.025 |
| 12/4/14 | 188.701 | 312.974 |
| 12/5/14 | 188.301 | 312.533 |
| 12/8/14 | 188.448 | 311.404 |
| 12/9/14 | 188.664 | 309.375 |
| 12/10/14 | 188.681 | 307.796 |
| 12/11/14 | 188.559 | 307.125 |
| 12/12/14 | 188.929 | 305.319 |
| 12/15/14 | 188.561 | 303.76 |
| 12/16/14 | 188.411 | 302.104 |
| 12/17/14 | 188.632 | 304.814 |
| 12/18/14 | 188.376 | 308.594 |
| 12/19/14 | 188.733 | 309.774 |
| 12/22/14 | 188.996 | 310.688 |
| 12/23/14 | 188.785 | 311.246 |
| 12/24/14 | 188.507 | 311.397 |
| 12/26/14 | 188.632 | 311.433 |
| 12/29/14 | 188.966 | 311.834 |
| 12/30/14 | 189.326 | 311.52 |
| 12/31/14 | 189.333 | 311.585 |
| 1/2/15 | 189.707 | 311.981 |
| 1/5/15 | 190.061 | 310.514 |
| 1/6/15 | 190.617 | 309.236 |
| 1/7/15 | 190.665 | 310.323 |
| 1/8/15 | 190.51 | 312.032 |
| 1/9/15 | 190.821 | 312.279 |
| 1/12/15 | 191.135 | 312.116 |
| 1/13/15 | 191.197 | 311.828 |
| 1/14/15 | 191.521 | 311.162 |
| 1/15/15 | 191.841 | 311.605 |
| 1/16/15 | 191.445 | 311.391 |
| 1/20/15 | 191.389 | 311.144 |
| 1/21/15 | 191.221 | 311.199 |
| 1/22/15 | 191.103 | 311.857 |
| 1/23/15 | 191.851 | 312.326 |
| 1/26/15 | 191.9 | 312.417 |
| 1/27/15 | 192.1 | 312.884 |
| 1/28/15 | 192.361 | 313.314 |
| 1/29/15 | 192.305 | 313.305 |
| 1/30/15 | 192.95 | 313.334 |
| 2/2/15 | 192.968 | 313.318 |
| 2/3/15 | 192.453 | 314.525 |
| 2/4/15 | 192.202 | 315.219 |
| 2/5/15 | 192.42 | 315.883 |
| 2/6/15 | 191.635 | 316.843 |
| 2/9/15 | 191.513 | 316.93 |
| 2/10/15 | 191.119 | 317.059 |
| 2/11/15 | 191.011 | 316.766 |
| 2/12/15 | 191.228 | 316.948 |
| 2/13/15 | 191.17 | 317.553 |
| 2/17/15 | 190.516 | 317.925 |
| 2/18/15 | 190.732 | 318.48 |
| 2/19/15 | 190.899 | 318.317 |
| 2/20/15 | 191.064 | 318.426 |
| 2/23/15 | 191.233 | 318.871 |
| 2/24/15 | 191.796 | 319.378 |
| 2/25/15 | 192.095 | 319.888 |
| 2/26/15 | 191.89 | 320.343 |
| 2/27/15 | 191.784 | 320.609 |
| 3/2/15 | 191.428 | 320.621 |
| 3/3/15 | 191.217 | 320.166 |
| 3/4/15 | 191.071 | 319.366 |
| 3/5/15 | 191.13 | 319.372 |
| 3/6/15 | 190.188 | 318.446 |
| 3/9/15 | 190.354 | 317.968 |
| 3/10/15 | 190.614 | 316.558 |
| 3/11/15 | 190.601 | 316.519 |
| 3/12/15 | 190.908 | 316.885 |
| 3/13/15 | 190.461 | 315.689 |
| 3/16/15 | 190.47 | 315.333 |
| 3/17/15 | 190.485 | 314.448 |
| 3/18/15 | 191.067 | 314.742 |
| 3/19/15 | 191.54 | 315.682 |
| 3/20/15 | 191.822 | 315.866 |
| 3/23/15 | 192.11 | 316.214 |
| 3/24/15 | 192.44 | 316.861 |
| 3/25/15 | 192.239 | 316.964 |
| 3/26/15 | 191.565 | 316.677 |
| 3/27/15 | 191.862 | 317.03 |
| 3/30/15 | 192.098 | 317.31 |
| 3/31/15 | 192.401 | 317.42 |
| 4/1/15 | 193.098 | 317.516 |
| 4/2/15 | 193.003 | 317.916 |
| 4/6/15 | 193.061 | 318.403 |
| 4/7/15 | 193.189 | 319.183 |
| 4/8/15 | 193.294 | 319.982 |
| 4/9/15 | 193.065 | 319.944 |
| 4/10/15 | 193.121 | 320.249 |
| 4/13/15 | 193.1 | 320.514 |
| 4/14/15 | 193.634 | 320.559 |
| 4/15/15 | 193.607 | 321.112 |
| 4/16/15 | 193.507 | 321.387 |
| 4/17/15 | 193.596 | 321.137 |
| 4/20/15 | 193.52 | 321.448 |
| 4/21/15 | 193.485 | 321.42 |
| 4/22/15 | 193.004 | 321.095 |
| 4/23/15 | 193.028 | 321.187 |
| 4/24/15 | 193.376 | 321.481 |
| 4/27/15 | 193.341 | 321.656 |
| 4/28/15 | 192.898 | 321.552 |
| 4/29/15 | 191.919 | 321.035 |
| 4/30/15 | 191.641 | 320.923 |
| 5/1/15 | 191.347 | 320.985 |
| 5/4/15 | 191.24 | 321.415 |
| 5/5/15 | 190.804 | 321.24 |
| 5/6/15 | 190.311 | 320.599 |
| 5/7/15 | 190.486 | 320.138 |
| 5/8/15 | 191.114 | 321.066 |
| 5/11/15 | 190.518 | 321.303 |
| 5/12/15 | 190.062 | 320.241 |
| 5/13/15 | 190.17 | 320.532 |
| 5/14/15 | 190.341 | 320.675 |
| 5/15/15 | 191.128 | 321.09 |
| 5/18/15 | 190.766 | 321.013 |
| 5/19/15 | 190.19 | 320.685 |
| 5/20/15 | 190.072 | 320.346 |
| 5/21/15 | 190.363 | 320.591 |
| 5/22/15 | 190.34 | 320.969 |
| 5/26/15 | 190.75 | 321.078 |
| 5/27/15 | 190.746 | 321.085 |
| 5/28/15 | 190.768 | 320.932 |
| 5/29/15 | 190.858 | 321.287 |
| 6/1/15 | 190.299 | 321.112 |
| 6/2/15 | 189.535 | 320.755 |
| 6/3/15 | 188.981 | 320.082 |
| 6/4/15 | 189.213 | 319.441 |
| 6/5/15 | 188.734 | 318.312 |
| 6/8/15 | 188.775 | 317.984 |
| 6/9/15 | 188.302 | 317.115 |
| 6/10/15 | 187.769 | 316.776 |
| 6/11/15 | 188.261 | 317.519 |
| 6/12/15 | 188.635 | 317.054 |
| 6/15/15 | 188.648 | 316.418 |
| 6/16/15 | 188.708 | 316.12 |
| 6/17/15 | 188.537 | 316.3 |
| 6/18/15 | 188.609 | 316.722 |
| 6/19/15 | 189.116 | 317.238 |
| 6/22/15 | 188.628 | 317.811 |
| 6/23/15 | 188.3 | 317.684 |
| 6/24/15 | 188.338 | 317.368 |
| 6/25/15 | 188.237 | 317.021 |
| 6/26/15 | 187.822 | 316.337 |
| 6/29/15 | 188.375 | 314.703 |
| 6/30/15 | 188.681 | 314.864 |
| 7/1/15 | 188.274 | 315.1 |
| 7/2/15 | 188.576 | 315.355 |
| 7/6/15 | 189.147 | 314.576 |
| 7/7/15 | 189.675 | 313.726 |
| 7/8/15 | 189.613 | 313.221 |
| 7/9/15 | 189.158 | 313.623 |
| 7/10/15 | 188.346 | 313.933 |
| 7/13/15 | 188.004 | 314.451 |
| 7/14/15 | 188.086 | 314.425 |
| 7/15/15 | 188.263 | 314.773 |
| 7/16/15 | 188.395 | 314.607 |
| 7/17/15 | 188.539 | 313.541 |
| 7/20/15 | 188.252 | 313.008 |
| 7/21/15 | 188.364 | 311.89 |
| 7/22/15 | 188.518 | 310.158 |
| 7/23/15 | 188.582 | 309.546 |
| 7/24/15 | 188.713 | 309.053 |
| 7/27/15 | 188.742 | 307.675 |
| 7/28/15 | 188.674 | 307.681 |
| 7/29/15 | 188.468 | 309.739 |
| 7/30/15 | 188.615 | 311.038 |
| 7/31/15 | 189.136 | 310.99 |
| 8/3/15 | 189.44 | 310.44 |
| 8/4/15 | 189.213 | 310.662 |
| 8/5/15 | 188.525 | 310.156 |
| 8/6/15 | 188.549 | 308.888 |
| 8/7/15 | 188.722 | 307.831 |
| 8/10/15 | 188.414 | 307.899 |
| 8/11/15 | 188.993 | 306.132 |
| 8/12/15 | 188.87 | 305.253 |
| 8/13/15 | 188.469 | 306.097 |
| 8/14/15 | 188.452 | 306.11 |
| 8/17/15 | 188.806 | 306.314 |
| 8/18/15 | 188.592 | 306.318 |
| 8/19/15 | 188.512 | 305.434 |
| 8/20/15 | 188.837 | 304.431 |
| 8/21/15 | 188.933 | 303.589 |
| 8/24/15 | 188.595 | 300.424 |
| 8/25/15 | 188.204 | 302.606 |
| 8/26/15 | 187.67 | 302.604 |
| 8/27/15 | 188.019 | 304.35 |
| 8/28/15 | 188.358 | 305.18 |
| 8/31/15 | 188.367 | 305.826 |
| 9/1/15 | 188.247 | 304.962 |
| 9/2/15 | 188.362 | 305.418 |
| 9/3/15 | 188.653 | 306.544 |
| 9/4/15 | 189.01 | 306.28 |
| 9/8/15 | 188.718 | 307.036 |
| 9/9/15 | 188.655 | 307.608 |
| 9/10/15 | 188.494 | 307.246 |
| 9/11/15 | 188.665 | 307.363 |
| 9/14/15 | 188.69 | 307.074 |
| 9/15/15 | 188.159 | 306.609 |
| 9/16/15 | 187.944 | 305.521 |
| 9/17/15 | 188.34 | 305.22 |
| 9/18/15 | 189.306 | 304.649 |
| 9/21/15 | 189.059 | 304.37 |
| 9/22/15 | 189.258 | 302.461 |
| 9/23/15 | 189.047 | 301.926 |
| 9/24/15 | 189.028 | 299.581 |
| 9/25/15 | 188.577 | 299.012 |
| 9/28/15 | 188.471 | 295.006 |
| 9/29/15 | 188.44 | 293.54 |
| 9/30/15 | 188.623 | 294.564 |
| 10/1/15 | 188.623 | 294.486 |
| 10/2/15 | 189.14 | 293.886 |
| 10/5/15 | 189.025 | 296.403 |
| 10/6/15 | 189.276 | 299.244 |
| 10/7/15 | 189.595 | 302.748 |
| 10/8/15 | 189.43 | 302.803 |
| 10/9/15 | 189.435 | 305.191 |
| 10/12/15 | 189.631 | 305.396 |
| 10/13/15 | 189.828 | 304.61 |
| 10/14/15 | 190.284 | 303.801 |
| 10/15/15 | 190.206 | 303.775 |
| 10/16/15 | 190.278 | 305.084 |
| 10/19/15 | 190.23 | 305.351 |
| 10/20/15 | 190.028 | 305.83 |
| 10/21/15 | 190.51 | 306.449 |
| 10/22/15 | 190.755 | 305.933 |
| 10/23/15 | 190.542 | 306.998 |
| 10/26/15 | 190.885 | 307.039 |
| 10/27/15 | 190.974 | 306.329 |
| 10/28/15 | 190.541 | 306.511 |
| 10/29/15 | 189.77 | 306.829 |
| 10/30/15 | 189.791 | 306.783 |
| 11/2/15 | 189.726 | 307.628 |
| 11/3/15 | 189.6 | 308.064 |
| 11/4/15 | 189.523 | 308.412 |
| 11/5/15 | 189.453 | 307.838 |
| 11/6/15 | 188.847 | 306.34 |
| 11/9/15 | 188.6 | 304.619 |
| 11/10/15 | 188.716 | 303.578 |
| 11/11/15 | 188.833 | 303.745 |
| 11/12/15 | 188.608 | 301.988 |
| 11/13/15 | 188.887 | 300.485 |
| 11/16/15 | 189.089 | 299.857 |
| 11/17/15 | 189.003 | 301.109 |
| 11/18/15 | 189.028 | 300.852 |
| 11/19/15 | 189.435 | 299.564 |
| 11/20/15 | 189.385 | 299.468 |
| 11/23/15 | 189.322 | 298.54 |
| 11/24/15 | 189.411 | 297.716 |
| 11/25/15 | 189.478 | 297.794 |
| 11/27/15 | 189.585 | 297.664 |
| 11/30/15 | 189.558 | 298.227 |
| 12/1/15 | 190.086 | 299.118 |
| 12/2/15 | 189.953 | 299.72 |
| 12/3/15 | 188.758 | 298.59 |
| 12/4/15 | 188.919 | 297.419 |
| 12/7/15 | 189.292 | 295.635 |
| 12/8/15 | 188.972 | 293.107 |
| 12/9/15 | 188.913 | 293.184 |
| 12/10/15 | 188.785 | 292.429 |
| 12/11/15 | 188.792 | 288.532 |
| 12/14/15 | 187.841 | 284.516 |
| 12/15/15 | 187.577 | 286.934 |
| 12/16/15 | 187.538 | 288.067 |
| 12/17/15 | 187.998 | 288.032 |
| 12/18/15 | 188.195 | 285.949 |
| 12/21/15 | 188.295 | 285.827 |
| 12/22/15 | 188.067 | 286.645 |
| 12/23/15 | 188.046 | 288.156 |
| 12/24/15 | 188.194 | 288.68 |
| 12/28/15 | 188.439 | 288.682 |
| 12/29/15 | 188.099 | 289.708 |
| 12/30/15 | 188.072 | 289.923 |
| 12/31/15 | 188.32 | 289.896 |